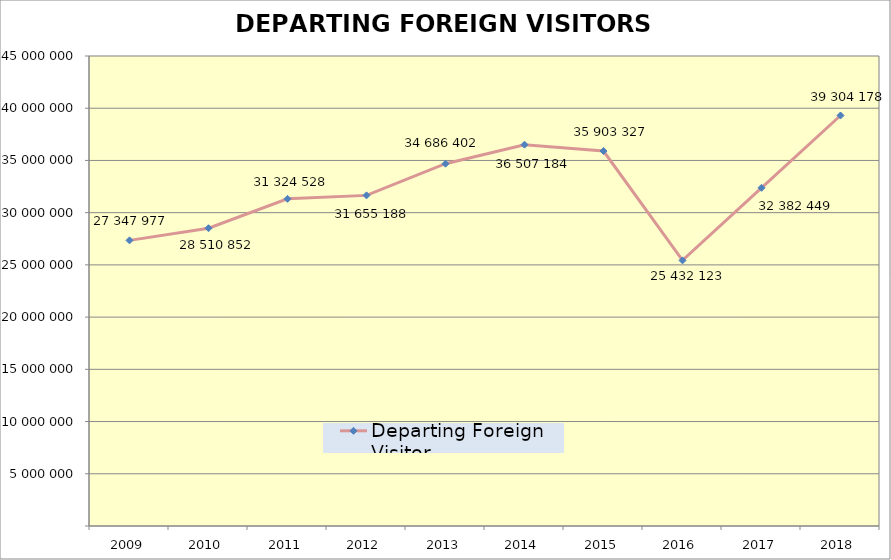
| Category | Departing Foreign Visitor |
|---|---|
| 2009 | 27347977 |
| 2010 | 28510852 |
| 2011 | 31324528 |
| 2012 | 31655188 |
| 2013 | 34686402 |
| 2014 | 36507184 |
| 2015 | 35903327 |
| 2016 | 25432123 |
| 2017 | 32382449 |
| 2018 | 39304178 |